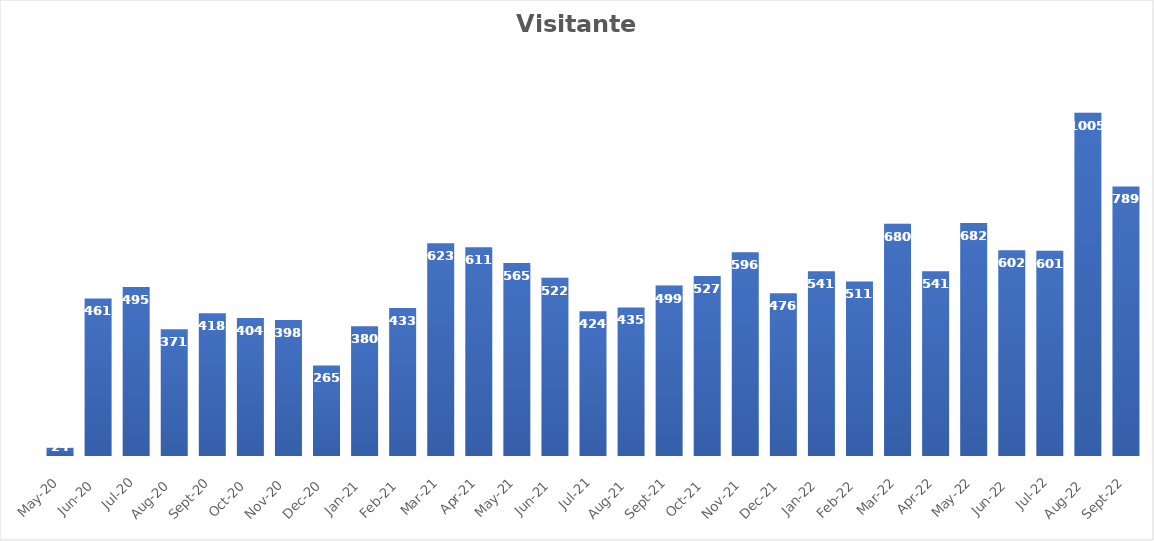
| Category | Visitantes |
|---|---|
| 2020-05-01 | 24 |
| 2020-06-01 | 461 |
| 2020-07-01 | 495 |
| 2020-08-01 | 371 |
| 2020-09-01 | 418 |
| 2020-10-01 | 404 |
| 2020-11-01 | 398 |
| 2020-12-01 | 265 |
| 2021-01-01 | 380 |
| 2021-02-01 | 433 |
| 2021-03-01 | 623 |
| 2021-04-01 | 611 |
| 2021-05-01 | 565 |
| 2021-06-01 | 522 |
| 2021-07-01 | 424 |
| 2021-08-01 | 435 |
| 2021-09-01 | 499 |
| 2021-10-01 | 527 |
| 2021-11-01 | 596 |
| 2021-12-01 | 476 |
| 2022-01-01 | 541 |
| 2022-02-01 | 511 |
| 2022-03-01 | 680 |
| 2022-04-01 | 541 |
| 2022-05-01 | 682 |
| 2022-06-01 | 602 |
| 2022-07-01 | 601 |
| 2022-08-01 | 1005 |
| 2022-09-01 | 789 |